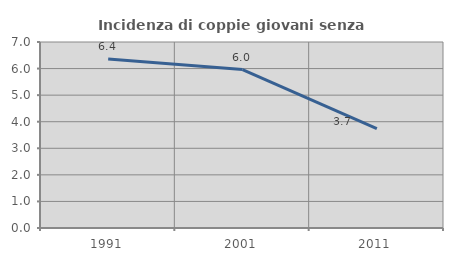
| Category | Incidenza di coppie giovani senza figli |
|---|---|
| 1991.0 | 6.364 |
| 2001.0 | 5.964 |
| 2011.0 | 3.738 |